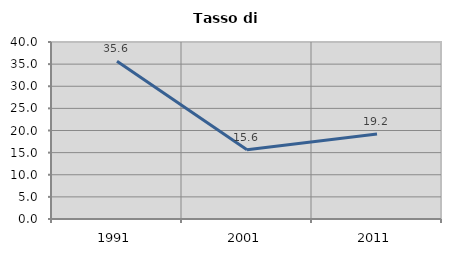
| Category | Tasso di disoccupazione   |
|---|---|
| 1991.0 | 35.648 |
| 2001.0 | 15.649 |
| 2011.0 | 19.221 |